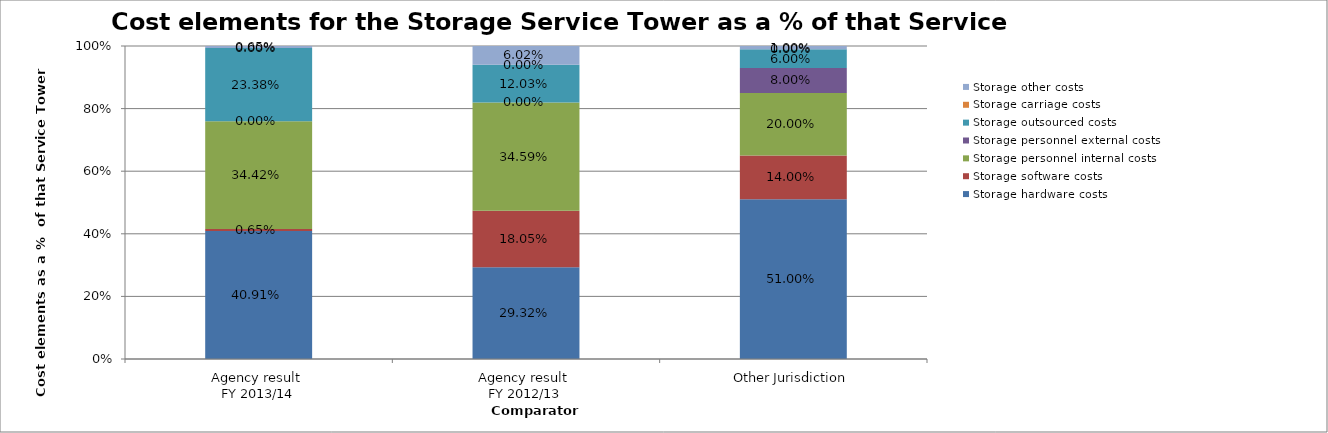
| Category | Storage hardware costs | Storage software costs | Storage personnel internal costs | Storage personnel external costs | Storage outsourced costs | Storage carriage costs | Storage other costs |
|---|---|---|---|---|---|---|---|
| Agency result 
FY 2013/14 | 0.409 | 0.006 | 0.344 | 0 | 0.234 | 0 | 0.006 |
| Agency result 
FY 2012/13 | 0.293 | 0.18 | 0.346 | 0 | 0.12 | 0 | 0.06 |
| Other Jurisdiction | 0.51 | 0.14 | 0.2 | 0.08 | 0.06 | 0 | 0.01 |